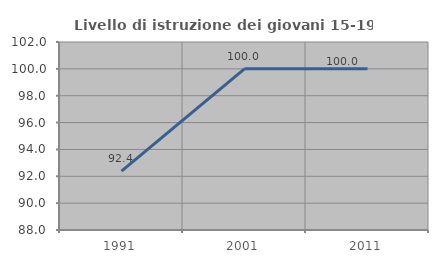
| Category | Livello di istruzione dei giovani 15-19 anni |
|---|---|
| 1991.0 | 92.381 |
| 2001.0 | 100 |
| 2011.0 | 100 |